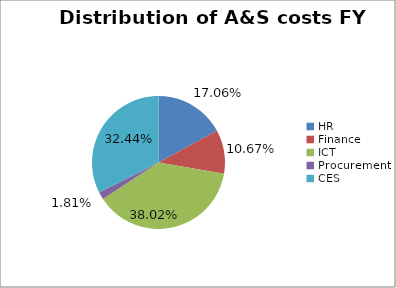
| Category | Distribution of A&S costs FY 2011/12 |
|---|---|
| HR | 0.171 |
| Finance | 0.107 |
| ICT | 0.38 |
| Procurement | 0.018 |
| CES | 0.324 |